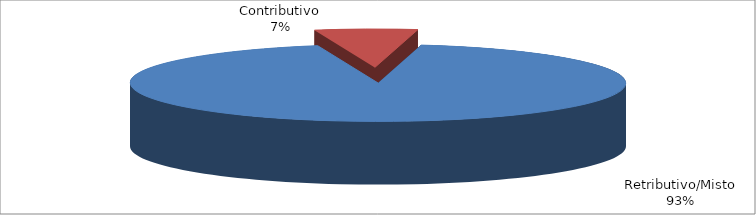
| Category | Decorrenti gennaio - marzo 2023 |
|---|---|
| Retributivo/Misto | 77488 |
| Contributivo | 5556 |